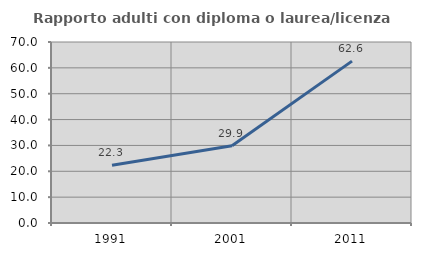
| Category | Rapporto adulti con diploma o laurea/licenza media  |
|---|---|
| 1991.0 | 22.321 |
| 2001.0 | 29.859 |
| 2011.0 | 62.595 |